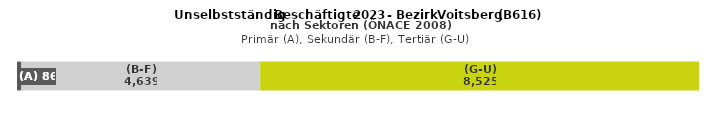
| Category | (A) | (B-F) | (G-U) |
|---|---|---|---|
| 0 | 86 | 4639 | 8525 |